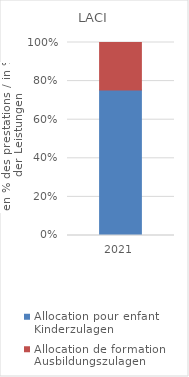
| Category | Allocation pour enfant | Allocation de formation |
|---|---|---|
| 2021.0 | 0.754 | 0.246 |